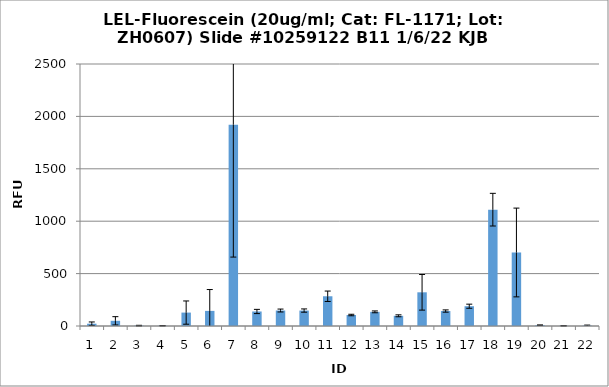
| Category | Series 0 |
|---|---|
| 0 | 22 |
| 1 | 49.5 |
| 2 | 3.5 |
| 3 | 2.25 |
| 4 | 128 |
| 5 | 144.25 |
| 6 | 1921.25 |
| 7 | 138.5 |
| 8 | 147.75 |
| 9 | 147.25 |
| 10 | 283.75 |
| 11 | 104.75 |
| 12 | 135 |
| 13 | 97.25 |
| 14 | 321.5 |
| 15 | 142.75 |
| 16 | 188.75 |
| 17 | 1110 |
| 18 | 701.5 |
| 19 | 8 |
| 20 | 1.75 |
| 21 | 3.75 |